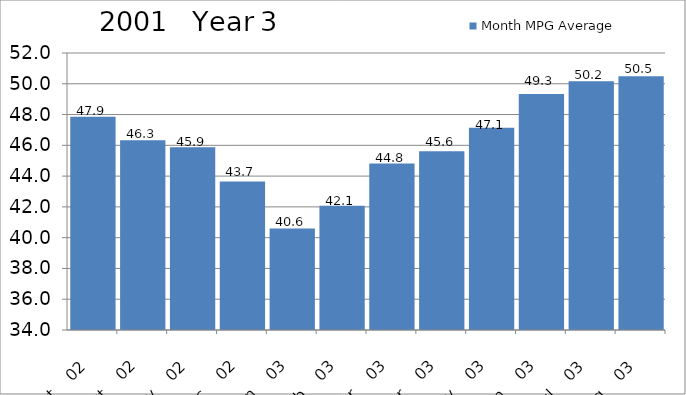
| Category | Month MPG Average |
|---|---|
| 2002-09-01 | 47.851 |
| 2002-10-01 | 46.332 |
| 2002-11-01 | 45.881 |
| 2002-12-01 | 43.656 |
| 2003-01-01 | 40.596 |
| 2003-02-01 | 42.08 |
| 2003-03-01 | 44.825 |
| 2003-04-01 | 45.607 |
| 2003-05-01 | 47.149 |
| 2003-06-01 | 49.339 |
| 2003-07-01 | 50.158 |
| 2003-08-01 | 50.497 |